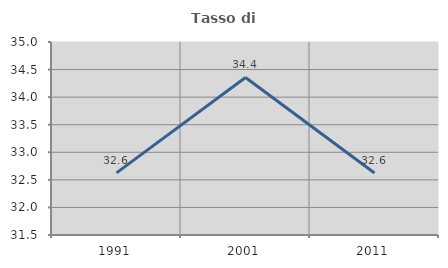
| Category | Tasso di occupazione   |
|---|---|
| 1991.0 | 32.626 |
| 2001.0 | 34.357 |
| 2011.0 | 32.624 |